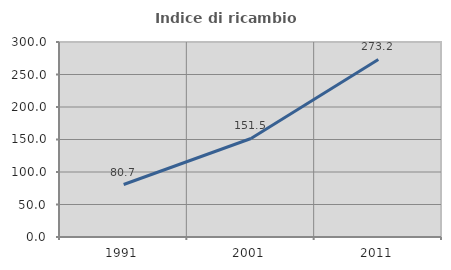
| Category | Indice di ricambio occupazionale  |
|---|---|
| 1991.0 | 80.741 |
| 2001.0 | 151.546 |
| 2011.0 | 273.171 |